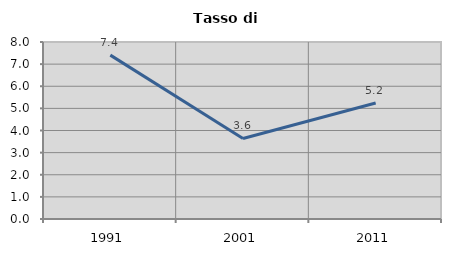
| Category | Tasso di disoccupazione   |
|---|---|
| 1991.0 | 7.407 |
| 2001.0 | 3.64 |
| 2011.0 | 5.243 |